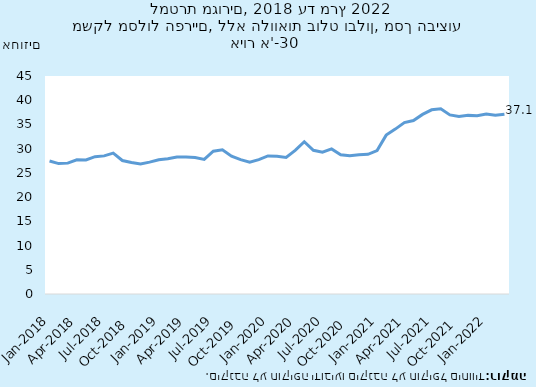
| Category | משקל מסלול הפריים, ללא הלוואות בולט ובלון, מסך הביצועים למטרת מגורים |
|---|---|
| 2018-01-31 | 27.453 |
| 2018-02-28 | 26.918 |
| 2018-03-31 | 27.015 |
| 2018-04-30 | 27.716 |
| 2018-05-31 | 27.655 |
| 2018-06-30 | 28.352 |
| 2018-07-31 | 28.509 |
| 2018-08-31 | 29.077 |
| 2018-09-30 | 27.557 |
| 2018-10-31 | 27.143 |
| 2018-11-30 | 26.864 |
| 2018-12-31 | 27.22 |
| 2019-01-31 | 27.719 |
| 2019-02-28 | 27.919 |
| 2019-03-31 | 28.289 |
| 2019-04-30 | 28.269 |
| 2019-05-31 | 28.158 |
| 2019-06-30 | 27.775 |
| 2019-07-31 | 29.471 |
| 2019-08-31 | 29.761 |
| 2019-09-30 | 28.438 |
| 2019-10-31 | 27.726 |
| 2019-11-30 | 27.195 |
| 2019-12-31 | 27.747 |
| 2020-01-31 | 28.492 |
| 2020-02-29 | 28.424 |
| 2020-03-31 | 28.199 |
| 2020-04-30 | 29.642 |
| 2020-05-31 | 31.434 |
| 2020-06-30 | 29.673 |
| 2020-07-31 | 29.265 |
| 2020-08-31 | 29.945 |
| 2020-09-30 | 28.76 |
| 2020-10-31 | 28.542 |
| 2020-11-30 | 28.764 |
| 2020-12-31 | 28.824 |
| 2021-01-31 | 29.605 |
| 2021-02-28 | 32.796 |
| 2021-03-31 | 34.037 |
| 2021-04-30 | 35.383 |
| 2021-05-31 | 35.81 |
| 2021-06-30 | 37.074 |
| 2021-07-31 | 38.023 |
| 2021-08-31 | 38.232 |
| 2021-09-30 | 36.965 |
| 2021-10-31 | 36.638 |
| 2021-11-30 | 36.872 |
| 2021-12-31 | 36.813 |
| 2022-01-31 | 37.159 |
| 2022-02-28 | 36.898 |
| 2022-03-31 | 37.122 |